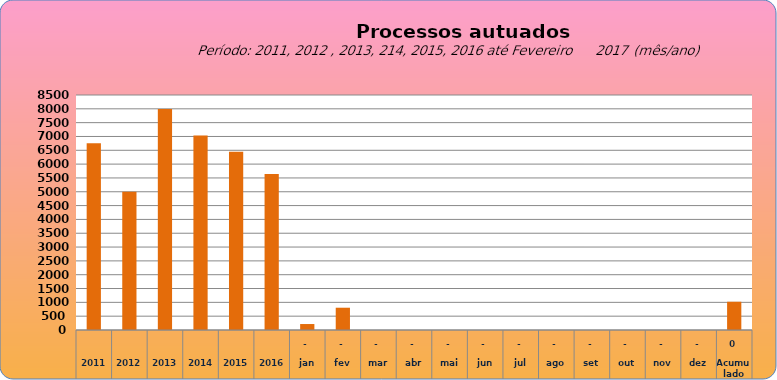
| Category | 6755 |
|---|---|
| 2011 | 6755 |
| 2012 | 4997 |
| 2013 | 7990 |
| 2014 | 7034 |
| 2015 | 6446 |
| 2016 | 5644 |
| jan | 216 |
| fev | 806 |
| mar | 0 |
| abr | 0 |
| mai | 0 |
| jun | 0 |
| jul | 0 |
| ago | 0 |
| set | 0 |
| out | 0 |
| nov | 0 |
| dez | 0 |
| Acumulado
 | 1022 |